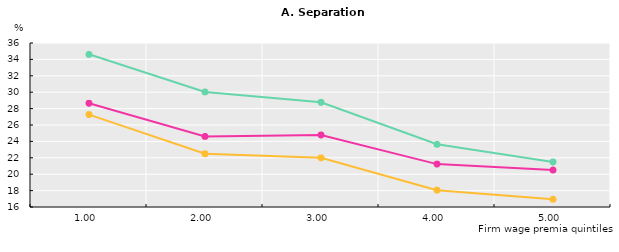
| Category | 25 to 34 | 35 to 49 | 50 to 60 |
|---|---|---|---|
| 1.0 | 34.621 | 27.268 | 28.643 |
| 2.0 | 30.036 | 22.493 | 24.61 |
| 3.0 | 28.762 | 21.993 | 24.777 |
| 4.0 | 23.65 | 18.053 | 21.231 |
| 5.0 | 21.487 | 16.955 | 20.516 |